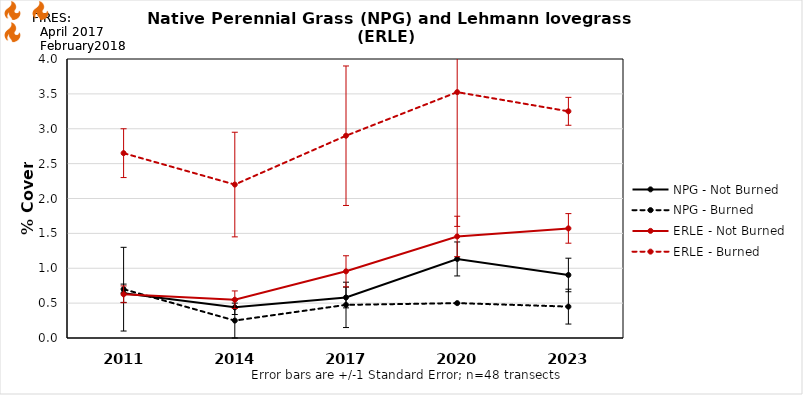
| Category | NPG - Not Burned | NPG - Burned | ERLE - Not Burned | ERLE - Burned |
|---|---|---|---|---|
| 2011.0 | 0.642 | 0.7 | 0.626 | 2.65 |
| 2014.0 | 0.439 | 0.25 | 0.549 | 2.2 |
| 2017.0 | 0.581 | 0.475 | 0.956 | 2.9 |
| 2020.0 | 1.133 | 0.5 | 1.456 | 3.525 |
| 2023.0 | 0.904 | 0.45 | 1.571 | 3.25 |